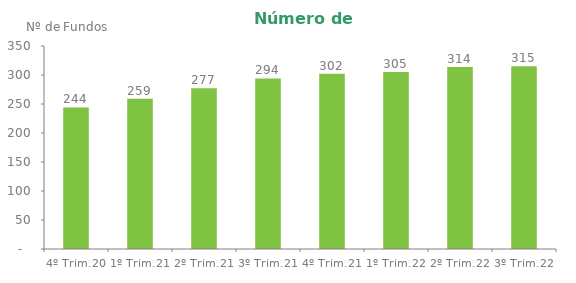
| Category | Series 0 |
|---|---|
| 4º Trim.20 | 244 |
| 1º Trim.21 | 259 |
| 2º Trim.21 | 277 |
| 3º Trim.21 | 294 |
| 4º Trim.21 | 302 |
| 1º Trim.22 | 305 |
| 2º Trim.22 | 314 |
| 3º Trim.22 | 315 |